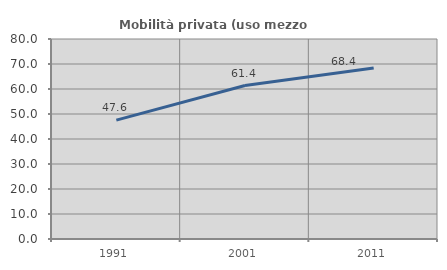
| Category | Mobilità privata (uso mezzo privato) |
|---|---|
| 1991.0 | 47.555 |
| 2001.0 | 61.377 |
| 2011.0 | 68.388 |